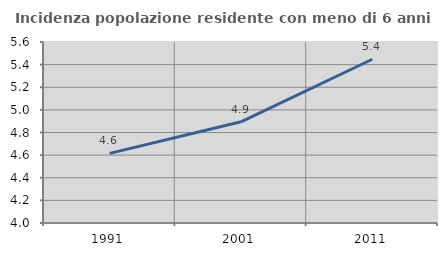
| Category | Incidenza popolazione residente con meno di 6 anni |
|---|---|
| 1991.0 | 4.616 |
| 2001.0 | 4.894 |
| 2011.0 | 5.447 |